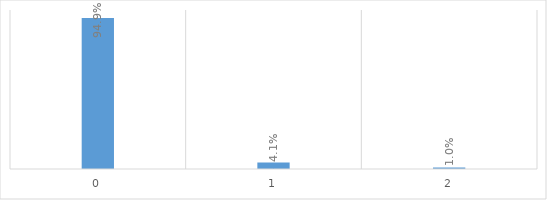
| Category | Series 0 |
|---|---|
| 0.0 | 0.949 |
| 1.0 | 0.041 |
| 2.0 | 0.01 |